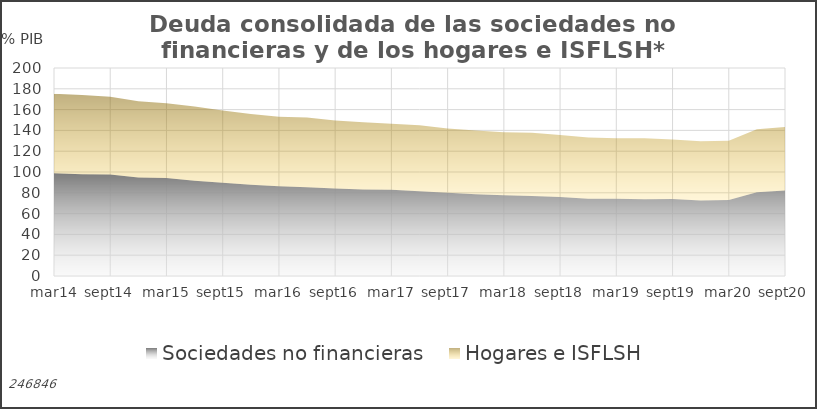
| Category | Sociedades no financieras | Hogares e ISFLSH |
|---|---|---|
| 2014-03-31 | 98.836 | 76.451 |
| 2014-06-30 | 97.756 | 76.343 |
| 2014-09-30 | 97.564 | 74.692 |
| 2014-12-31 | 94.655 | 73.414 |
| 2015-03-31 | 94.157 | 72.041 |
| 2015-06-30 | 91.533 | 71.448 |
| 2015-09-30 | 89.669 | 69.377 |
| 2015-12-31 | 87.748 | 68.046 |
| 2016-03-31 | 86.309 | 66.857 |
| 2016-06-30 | 85.44 | 66.931 |
| 2016-09-30 | 84.131 | 65.297 |
| 2016-12-31 | 83.249 | 64.502 |
| 2017-03-31 | 82.916 | 63.552 |
| 2017-06-30 | 81.418 | 63.463 |
| 2017-09-30 | 79.952 | 61.942 |
| 2017-12-31 | 78.603 | 61.193 |
| 2018-03-31 | 77.647 | 60.52 |
| 2018-06-30 | 76.971 | 60.748 |
| 2018-09-30 | 75.846 | 59.656 |
| 2018-12-31 | 74.264 | 58.926 |
| 2019-03-31 | 74.245 | 58.283 |
| 2019-06-30 | 73.79 | 58.554 |
| 2019-09-30 | 73.928 | 57.384 |
| 2019-12-31 | 72.523 | 56.928 |
| 2020-03-31 | 73.061 | 56.984 |
| 2020-06-30 | 80.552 | 60.635 |
| 2020-09-30 | 82.092 | 61.154 |